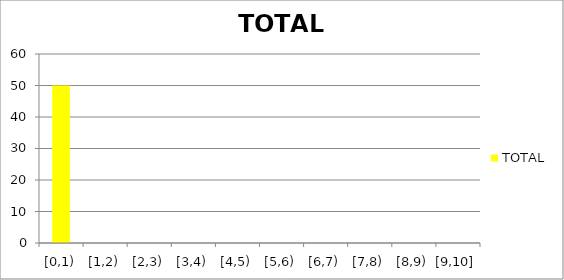
| Category | TOTAL |
|---|---|
| [0,1) | 50 |
| [1,2) | 0 |
| [2,3) | 0 |
| [3,4) | 0 |
| [4,5) | 0 |
| [5,6) | 0 |
| [6,7) | 0 |
| [7,8) | 0 |
| [8,9) | 0 |
| [9,10] | 0 |